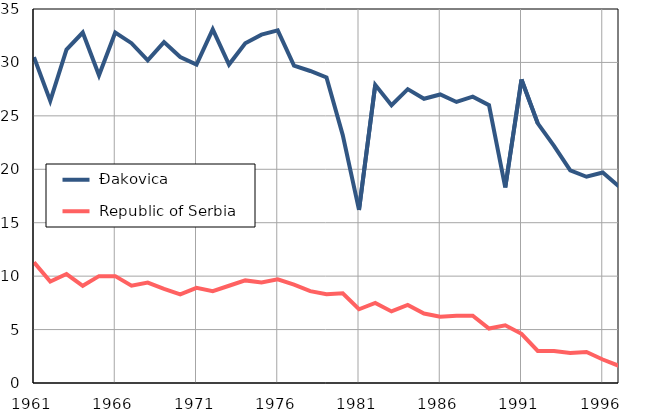
| Category |  Đakovica |  Republic of Serbia |
|---|---|---|
| 1961.0 | 30.5 | 11.3 |
| 1962.0 | 26.4 | 9.5 |
| 1963.0 | 31.2 | 10.2 |
| 1964.0 | 32.8 | 9.1 |
| 1965.0 | 28.8 | 10 |
| 1966.0 | 32.8 | 10 |
| 1967.0 | 31.8 | 9.1 |
| 1968.0 | 30.2 | 9.4 |
| 1969.0 | 31.9 | 8.8 |
| 1970.0 | 30.5 | 8.3 |
| 1971.0 | 29.8 | 8.9 |
| 1972.0 | 33.1 | 8.6 |
| 1973.0 | 29.8 | 9.1 |
| 1974.0 | 31.8 | 9.6 |
| 1975.0 | 32.6 | 9.4 |
| 1976.0 | 33 | 9.7 |
| 1977.0 | 29.7 | 9.2 |
| 1978.0 | 29.2 | 8.6 |
| 1979.0 | 28.6 | 8.3 |
| 1980.0 | 23.2 | 8.4 |
| 1981.0 | 16.2 | 6.9 |
| 1982.0 | 27.9 | 7.5 |
| 1983.0 | 26 | 6.7 |
| 1984.0 | 27.5 | 7.3 |
| 1985.0 | 26.6 | 6.5 |
| 1986.0 | 27 | 6.2 |
| 1987.0 | 26.3 | 6.3 |
| 1988.0 | 26.8 | 6.3 |
| 1989.0 | 26 | 5.1 |
| 1990.0 | 18.3 | 5.4 |
| 1991.0 | 28.4 | 4.6 |
| 1992.0 | 24.3 | 3 |
| 1993.0 | 22.2 | 3 |
| 1994.0 | 19.9 | 2.8 |
| 1995.0 | 19.3 | 2.9 |
| 1996.0 | 19.7 | 2.2 |
| 1997.0 | 18.4 | 1.6 |